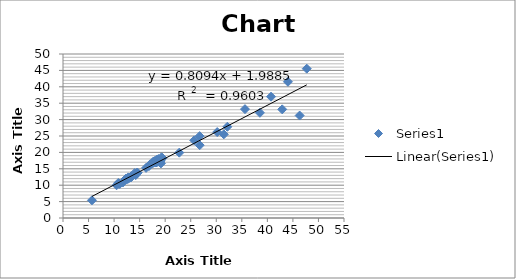
| Category | Series 0 |
|---|---|
| 46.3236387759022 | 31.238 |
| 35.6169189448871 | 33.191 |
| 18.2064230602116 | 16.918 |
| 19.1111357064196 | 17.436 |
| 12.220354404388301 | 11.663 |
| 14.4958037358975 | 13.784 |
| 26.744577591851698 | 24.958 |
| 11.703989188550699 | 10.816 |
| 14.022092045234599 | 13.681 |
| 12.263016332605 | 11.887 |
| 10.9646465484686 | 10.426 |
| 11.1224415449266 | 10.417 |
| 12.968514466766202 | 12.24 |
| 5.66812589071759 | 5.395 |
| 17.6576689793419 | 16.811 |
| 18.3044377615097 | 17.747 |
| 25.6872109757442 | 23.68 |
| 12.7957973346453 | 12.384 |
| 19.474505525452297 | 18.259 |
| 17.664248811638 | 17.184 |
| 17.4961396976149 | 16.778 |
| 16.8267861206908 | 15.841 |
| 38.5446933528803 | 32.074 |
| 13.3773648439653 | 12.742 |
| 44.0310534496315 | 41.53 |
| 12.7169104204222 | 12.159 |
| 14.4778295069182 | 13.776 |
| 10.481620019992901 | 9.978 |
| 14.3782978324304 | 13.612 |
| 13.321663582686899 | 12.377 |
| 16.2596540104818 | 15.279 |
| 18.668238665811 | 17.962 |
| 31.4763537173552 | 25.51 |
| 22.7646244504852 | 19.921 |
| 18.0542950703006 | 16.912 |
| 19.1748365833397 | 16.647 |
| 17.039464243042097 | 16.34 |
| 12.6672824756722 | 11.871 |
| 10.8245416556169 | 10.682 |
| 19.2846642465135 | 18.507 |
| 12.6125908811825 | 12.068 |
| 14.610193975278598 | 13.775 |
| 26.7555509952628 | 22.207 |
| 32.1668892370688 | 27.81 |
| 30.18333602614 | 26.204 |
| 40.7181817323821 | 36.982 |
| 17.9314167495971 | 17.336 |
| 14.5814428162037 | 13.752 |
| 47.709112755620794 | 45.525 |
| 42.9058223904559 | 33.122 |
| 18.527439628333102 | 17.114 |
| 14.2294446665583 | 13.068 |
| 12.2557723527835 | 11.879 |